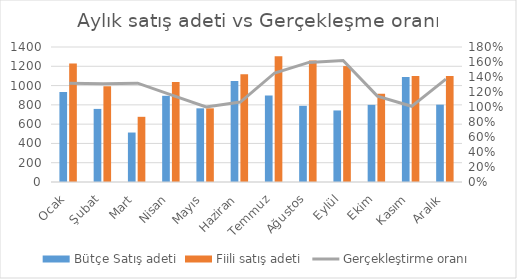
| Category | Bütçe Satış adeti | Fiili satış adeti |
|---|---|---|
| Ocak | 933 | 1229 |
| Şubat | 758 | 994 |
| Mart | 513 | 676 |
| Nisan | 894 | 1036 |
| Mayıs | 764 | 764 |
| Haziran | 1048 | 1117 |
| Temmuz | 897 | 1304 |
| Ağustos | 790 | 1260 |
| Eylül | 742 | 1202 |
| Ekim | 800 | 916 |
| Kasım | 1090 | 1100 |
| Aralık | 802 | 1100 |